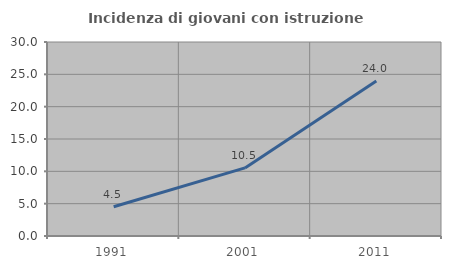
| Category | Incidenza di giovani con istruzione universitaria |
|---|---|
| 1991.0 | 4.523 |
| 2001.0 | 10.526 |
| 2011.0 | 23.97 |